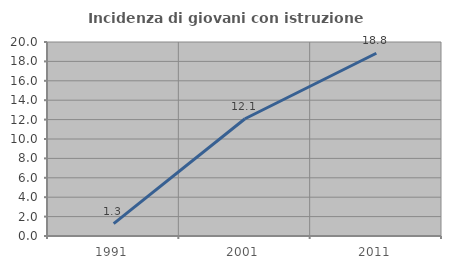
| Category | Incidenza di giovani con istruzione universitaria |
|---|---|
| 1991.0 | 1.282 |
| 2001.0 | 12.088 |
| 2011.0 | 18.841 |